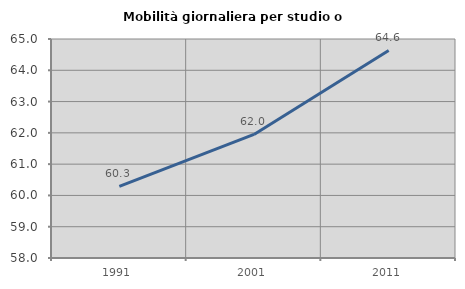
| Category | Mobilità giornaliera per studio o lavoro |
|---|---|
| 1991.0 | 60.287 |
| 2001.0 | 61.95 |
| 2011.0 | 64.633 |